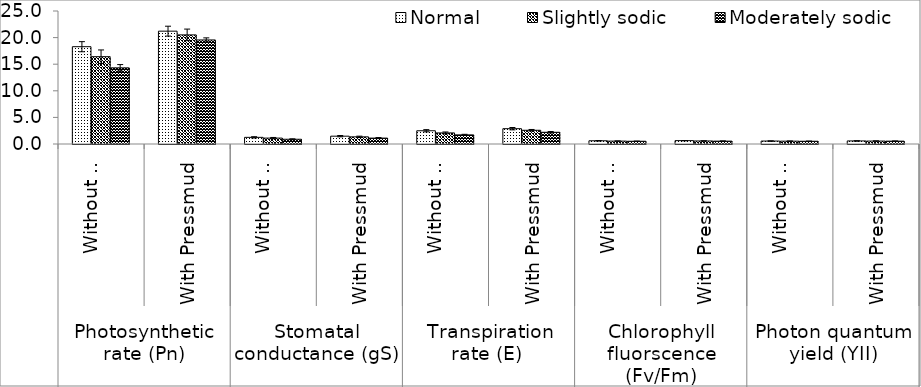
| Category | Normal | Slightly sodic | Moderately sodic |
|---|---|---|---|
| 0 | 18.29 | 16.41 | 14.31 |
| 1 | 21.21 | 20.51 | 19.56 |
| 2 | 1.25 | 1.11 | 0.89 |
| 3 | 1.47 | 1.34 | 1.11 |
| 4 | 2.49 | 2.08 | 1.71 |
| 5 | 2.88 | 2.58 | 2.2 |
| 6 | 0.606 | 0.545 | 0.515 |
| 7 | 0.634 | 0.569 | 0.54 |
| 8 | 0.553 | 0.532 | 0.516 |
| 9 | 0.576 | 0.552 | 0.535 |